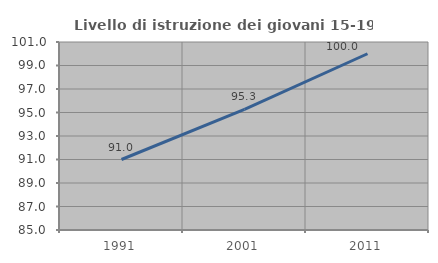
| Category | Livello di istruzione dei giovani 15-19 anni |
|---|---|
| 1991.0 | 91 |
| 2001.0 | 95.261 |
| 2011.0 | 100 |